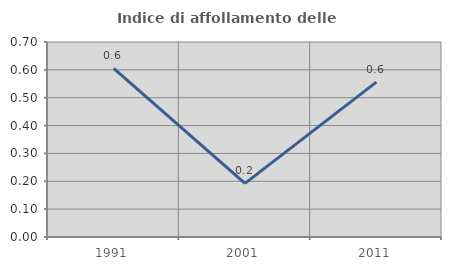
| Category | Indice di affollamento delle abitazioni  |
|---|---|
| 1991.0 | 0.605 |
| 2001.0 | 0.193 |
| 2011.0 | 0.556 |